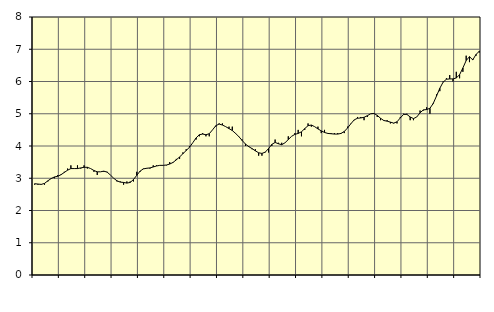
| Category | Piggar | Information och kommunikation, SNI 58-63 |
|---|---|---|
| nan | 2.8 | 2.83 |
| 87.0 | 2.8 | 2.82 |
| 87.0 | 2.8 | 2.81 |
| 87.0 | 2.8 | 2.84 |
| nan | 2.9 | 2.92 |
| 88.0 | 3 | 2.99 |
| 88.0 | 3 | 3.04 |
| 88.0 | 3.1 | 3.06 |
| nan | 3.1 | 3.11 |
| 89.0 | 3.2 | 3.18 |
| 89.0 | 3.3 | 3.25 |
| 89.0 | 3.4 | 3.3 |
| nan | 3.3 | 3.3 |
| 90.0 | 3.4 | 3.3 |
| 90.0 | 3.3 | 3.32 |
| 90.0 | 3.4 | 3.34 |
| nan | 3.3 | 3.34 |
| 91.0 | 3.3 | 3.3 |
| 91.0 | 3.2 | 3.24 |
| 91.0 | 3.1 | 3.2 |
| nan | 3.2 | 3.2 |
| 92.0 | 3.2 | 3.22 |
| 92.0 | 3.2 | 3.19 |
| 92.0 | 3.1 | 3.1 |
| nan | 3 | 3 |
| 93.0 | 2.9 | 2.92 |
| 93.0 | 2.9 | 2.88 |
| 93.0 | 2.8 | 2.87 |
| nan | 2.9 | 2.85 |
| 94.0 | 2.9 | 2.87 |
| 94.0 | 2.9 | 2.96 |
| 94.0 | 3.2 | 3.09 |
| nan | 3.2 | 3.22 |
| 95.0 | 3.3 | 3.29 |
| 95.0 | 3.3 | 3.31 |
| 95.0 | 3.3 | 3.32 |
| nan | 3.4 | 3.35 |
| 96.0 | 3.4 | 3.38 |
| 96.0 | 3.4 | 3.4 |
| 96.0 | 3.4 | 3.4 |
| nan | 3.4 | 3.41 |
| 97.0 | 3.5 | 3.44 |
| 97.0 | 3.5 | 3.49 |
| 97.0 | 3.6 | 3.57 |
| nan | 3.6 | 3.66 |
| 98.0 | 3.8 | 3.76 |
| 98.0 | 3.9 | 3.86 |
| 98.0 | 4 | 3.96 |
| nan | 4.1 | 4.1 |
| 99.0 | 4.2 | 4.25 |
| 99.0 | 4.3 | 4.35 |
| 99.0 | 4.4 | 4.37 |
| nan | 4.3 | 4.35 |
| 0.0 | 4.3 | 4.38 |
| 0.0 | 4.5 | 4.5 |
| 0.0 | 4.6 | 4.63 |
| nan | 4.7 | 4.68 |
| 1.0 | 4.7 | 4.65 |
| 1.0 | 4.6 | 4.6 |
| 1.0 | 4.6 | 4.54 |
| nan | 4.6 | 4.48 |
| 2.0 | 4.4 | 4.39 |
| 2.0 | 4.3 | 4.29 |
| 2.0 | 4.2 | 4.17 |
| nan | 4 | 4.06 |
| 3.0 | 4 | 3.98 |
| 3.0 | 3.9 | 3.92 |
| 3.0 | 3.9 | 3.85 |
| nan | 3.7 | 3.79 |
| 4.0 | 3.7 | 3.77 |
| 4.0 | 3.8 | 3.81 |
| 4.0 | 3.8 | 3.92 |
| nan | 4 | 4.05 |
| 5.0 | 4.2 | 4.11 |
| 5.0 | 4.1 | 4.07 |
| 5.0 | 4.1 | 4.04 |
| nan | 4.1 | 4.1 |
| 6.0 | 4.3 | 4.2 |
| 6.0 | 4.3 | 4.3 |
| 6.0 | 4.4 | 4.36 |
| nan | 4.5 | 4.39 |
| 7.0 | 4.3 | 4.44 |
| 7.0 | 4.5 | 4.54 |
| 7.0 | 4.7 | 4.63 |
| nan | 4.6 | 4.65 |
| 8.0 | 4.6 | 4.6 |
| 8.0 | 4.6 | 4.53 |
| 8.0 | 4.4 | 4.47 |
| nan | 4.5 | 4.42 |
| 9.0 | 4.4 | 4.39 |
| 9.0 | 4.4 | 4.38 |
| 9.0 | 4.4 | 4.37 |
| nan | 4.4 | 4.37 |
| 10.0 | 4.4 | 4.39 |
| 10.0 | 4.4 | 4.45 |
| 10.0 | 4.6 | 4.56 |
| nan | 4.7 | 4.69 |
| 11.0 | 4.8 | 4.81 |
| 11.0 | 4.9 | 4.86 |
| 11.0 | 4.9 | 4.87 |
| nan | 4.8 | 4.89 |
| 12.0 | 4.9 | 4.94 |
| 12.0 | 5 | 5 |
| 12.0 | 5 | 5.01 |
| nan | 4.9 | 4.95 |
| 13.0 | 4.8 | 4.86 |
| 13.0 | 4.8 | 4.79 |
| 13.0 | 4.8 | 4.77 |
| nan | 4.7 | 4.74 |
| 14.0 | 4.7 | 4.71 |
| 14.0 | 4.7 | 4.75 |
| 14.0 | 4.9 | 4.87 |
| nan | 5 | 4.98 |
| 15.0 | 5 | 4.98 |
| 15.0 | 4.8 | 4.9 |
| 15.0 | 4.8 | 4.85 |
| nan | 4.9 | 4.9 |
| 16.0 | 5.1 | 5.03 |
| 16.0 | 5.1 | 5.12 |
| 16.0 | 5.2 | 5.13 |
| nan | 5 | 5.17 |
| 17.0 | 5.3 | 5.32 |
| 17.0 | 5.6 | 5.55 |
| 17.0 | 5.7 | 5.79 |
| nan | 6 | 5.98 |
| 18.0 | 6.1 | 6.07 |
| 18.0 | 6.2 | 6.08 |
| 18.0 | 6 | 6.08 |
| nan | 6.3 | 6.11 |
| 19.0 | 6.1 | 6.21 |
| 19.0 | 6.3 | 6.42 |
| 19.0 | 6.8 | 6.65 |
| nan | 6.6 | 6.77 |
| 20.0 | 6.7 | 6.67 |
| 20.0 | 6.8 | 6.84 |
| 20.0 | 6.9 | 6.94 |